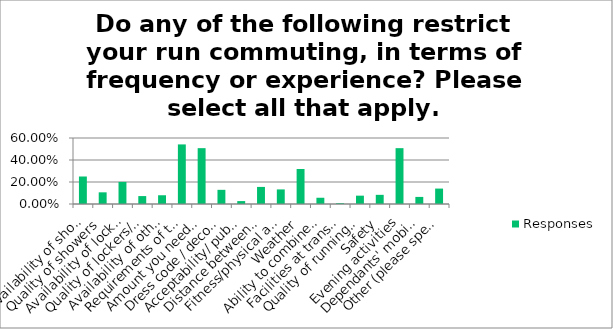
| Category | Responses |
|---|---|
| Availability of showers | 0.25 |
| Quality of showers | 0.106 |
| Availability of lockers/storage | 0.201 |
| Quality of lockers/storage | 0.072 |
| Availability of other workplace facilities | 0.08 |
| Requirements of the work day | 0.542 |
| Amount you need to take to work | 0.508 |
| Dress code / decorum at work | 0.129 |
| Acceptability/ public perception of run commuting | 0.026 |
| Distance between work and home | 0.155 |
| Fitness/physical ability | 0.133 |
| Weather | 0.318 |
| Ability to combine running with other modes of transport | 0.057 |
| Facilities at transport interchanges | 0.008 |
| Quality of running routes | 0.076 |
| Safety | 0.083 |
| Evening activities | 0.508 |
| Dependants' mobility needs | 0.064 |
| Other (please specify) | 0.14 |